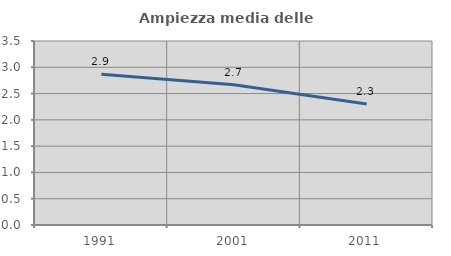
| Category | Ampiezza media delle famiglie |
|---|---|
| 1991.0 | 2.865 |
| 2001.0 | 2.666 |
| 2011.0 | 2.302 |